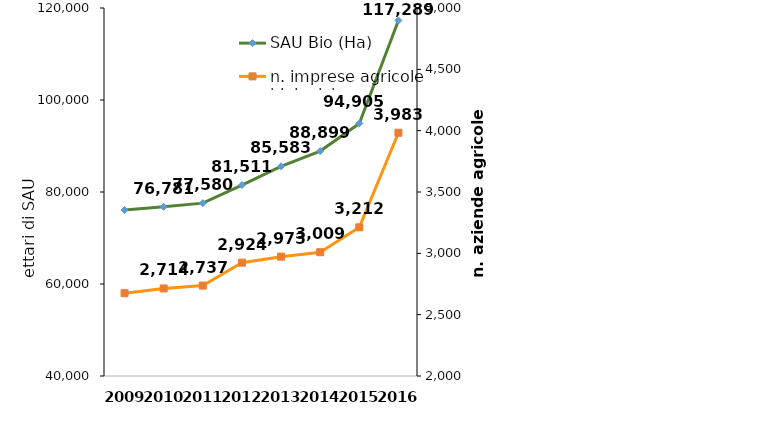
| Category | SAU Bio (Ha) |
|---|---|
| 2009 | 76082 |
| 2010 | 76781 |
| 2011 | 77579.787 |
| 2012 | 81511 |
| 2013 | 85583.003 |
| 2014 | 88899 |
| 2015 | 94905.018 |
| 2016 | 117289.433 |